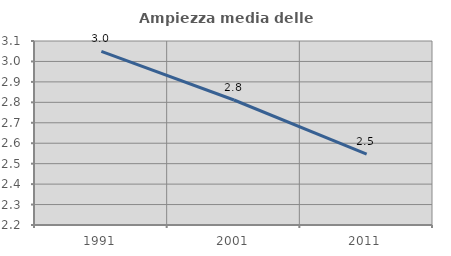
| Category | Ampiezza media delle famiglie |
|---|---|
| 1991.0 | 3.049 |
| 2001.0 | 2.811 |
| 2011.0 | 2.546 |